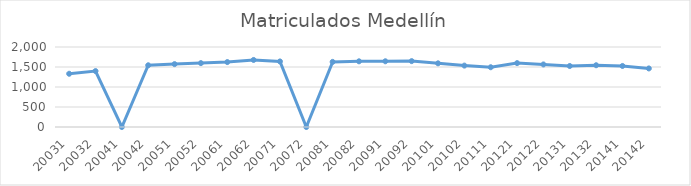
| Category | Matriculados Medellín |
|---|---|
| 20031 | 1331 |
| 20032 | 1398 |
| 20041 | 0 |
| 20042 | 1543 |
| 20051 | 1572 |
| 20052 | 1597 |
| 20061 | 1623 |
| 20062 | 1676 |
| 20071 | 1639 |
| 20072 | 0 |
| 20081 | 1628 |
| 20082 | 1642 |
| 20091 | 1643 |
| 20092 | 1647 |
| 20101 | 1592 |
| 20102 | 1535 |
| 20111 | 1494 |
| 20121 | 1597 |
| 20122 | 1564 |
| 20131 | 1525 |
| 20132 | 1544 |
| 20141 | 1526 |
| 20142 | 1464 |